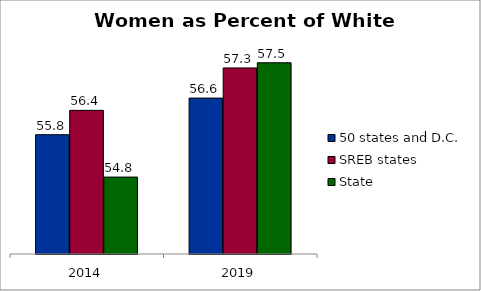
| Category | 50 states and D.C. | SREB states | State |
|---|---|---|---|
| 2014.0 | 55.788 | 56.356 | 54.797 |
| 2019.0 | 56.643 | 57.347 | 57.468 |